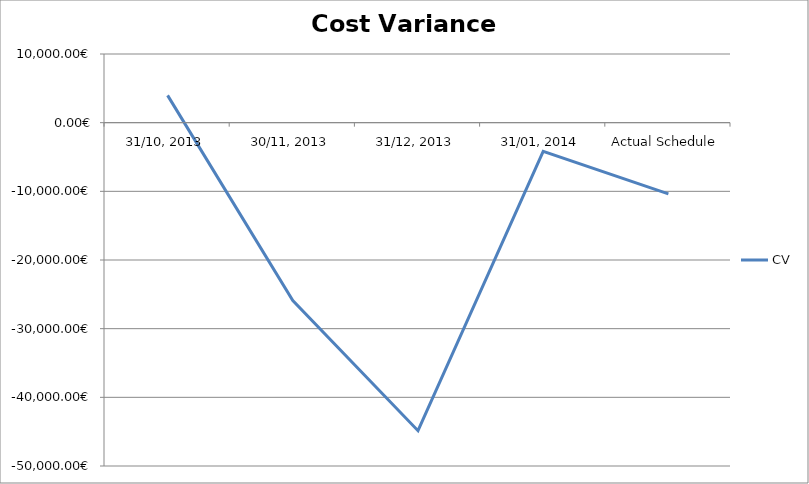
| Category | CV |
|---|---|
| 31/10, 2013 | 3970.778 |
| 30/11, 2013 | -25905.171 |
| 31/12, 2013 | -44864.001 |
| 31/01, 2014 | -4171.668 |
| Actual Schedule | -10371.96 |